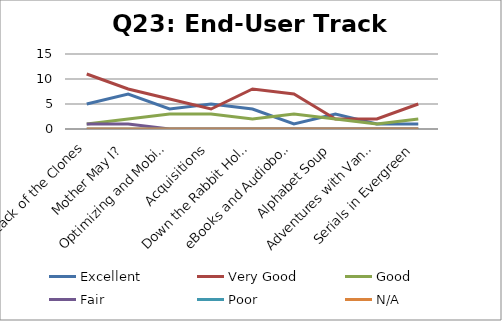
| Category | Excellent | Very Good | Good | Fair | Poor | N/A |
|---|---|---|---|---|---|---|
| Attack of the Clones | 5 | 11 | 1 | 1 | 0 | 0 |
| Mother May I? | 7 | 8 | 2 | 1 | 0 | 0 |
| Optimizing and Mobilizing Staff | 4 | 6 | 3 | 0 | 0 | 0 |
| Acquisitions | 5 | 4 | 3 | 0 | 0 | 0 |
| Down the Rabbit Hole (Part 1) | 4 | 8 | 2 | 0 | 0 | 0 |
| eBooks and Audiobooks | 1 | 7 | 3 | 0 | 0 | 0 |
| Alphabet Soup | 3 | 2 | 2 | 0 | 0 | 0 |
| Adventures with Vandelay | 1 | 2 | 1 | 0 | 0 | 0 |
| Serials in Evergreen | 1 | 5 | 2 | 0 | 0 | 0 |